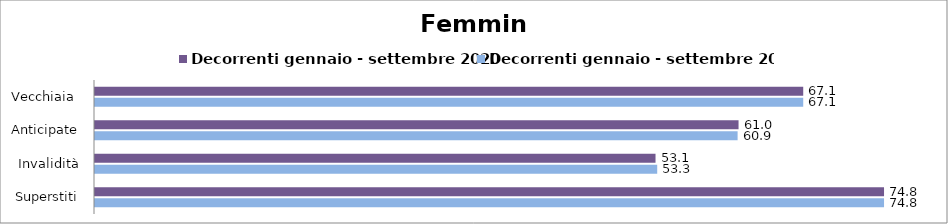
| Category | Decorrenti gennaio - settembre 2020 | Decorrenti gennaio - settembre 2021 |
|---|---|---|
| Vecchiaia  | 67.13 | 67.13 |
| Anticipate | 61 | 60.91 |
| Invalidità | 53.13 | 53.29 |
| Superstiti | 74.79 | 74.79 |